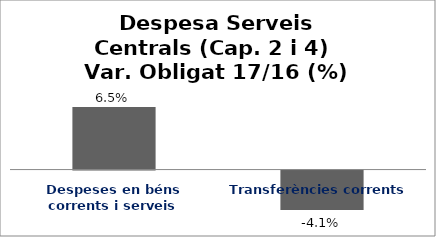
| Category | Series 0 |
|---|---|
| Despeses en béns corrents i serveis | 0.065 |
| Transferències corrents | -0.041 |